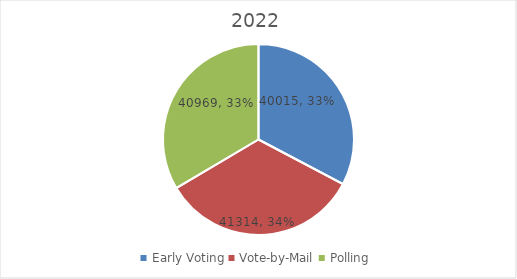
| Category | Series 0 |
|---|---|
| Early Voting | 40015 |
| Vote-by-Mail | 41314 |
| Polling | 40969 |